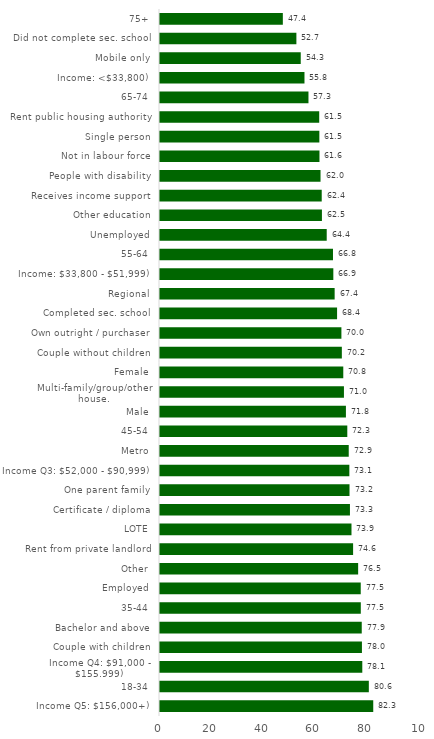
| Category | Series 0 |
|---|---|
| Income Q5: $156,000+) | 82.333 |
| 18-34 | 80.629 |
| Income Q4: $91,000 - $155,999) | 78.106 |
| Couple with children | 77.966 |
| Bachelor and above | 77.895 |
| 35-44 | 77.532 |
| Employed | 77.508 |
| Other | 76.504 |
| Rent from private landlord | 74.558 |
| LOTE | 73.933 |
| Certificate / diploma | 73.338 |
| One parent family | 73.171 |
| Income Q3: $52,000 - $90,999) | 73.107 |
| Metro | 72.871 |
| 45-54 | 72.316 |
| Male | 71.784 |
| Multi-family/group/other house. | 71.021 |
| Female | 70.766 |
| Couple without children | 70.211 |
| Own outright / purchaser | 70.041 |
| Completed sec. school | 68.371 |
| Regional | 67.432 |
| Income: $33,800 - $51,999) | 66.922 |
| 55-64 | 66.791 |
| Unemployed | 64.37 |
| Other education | 62.52 |
| Receives income support | 62.442 |
| People with disability | 61.98 |
| Not in labour force | 61.57 |
| Single person | 61.525 |
| Rent public housing authority | 61.473 |
| 65-74 | 57.324 |
| Income: <$33,800) | 55.784 |
| Mobile only | 54.34 |
| Did not complete sec. school | 52.66 |
| 75+ | 47.427 |